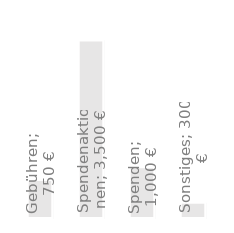
| Category | Jahreseinnahmen |
|---|---|
| Gebühren | 750 |
| Spendenaktionen | 3500 |
| Spenden | 1000 |
| Sonstiges | 300 |